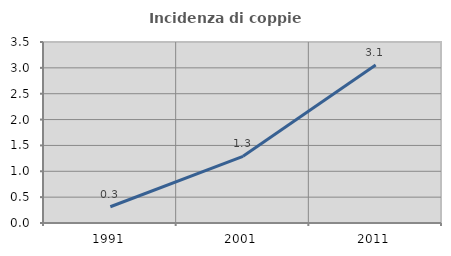
| Category | Incidenza di coppie miste |
|---|---|
| 1991.0 | 0.314 |
| 2001.0 | 1.289 |
| 2011.0 | 3.056 |